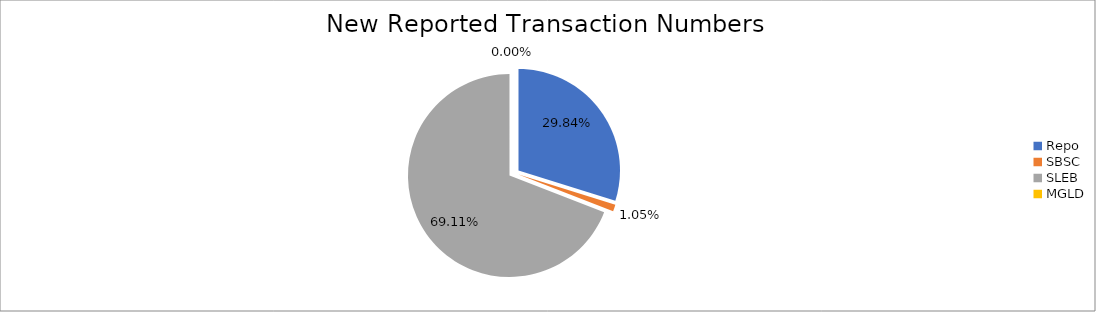
| Category | Series 0 |
|---|---|
| Repo | 287984 |
| SBSC | 10160 |
| SLEB | 667057 |
| MGLD | 23 |